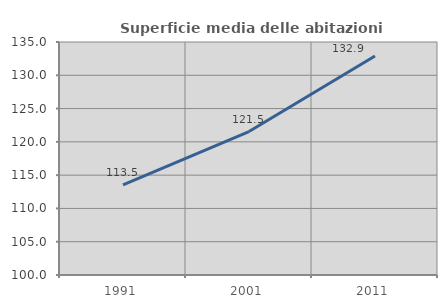
| Category | Superficie media delle abitazioni occupate |
|---|---|
| 1991.0 | 113.543 |
| 2001.0 | 121.545 |
| 2011.0 | 132.891 |